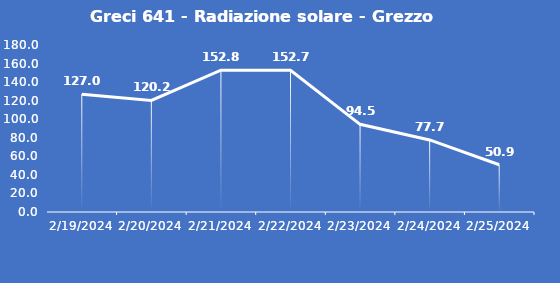
| Category | Greci 641 - Radiazione solare - Grezzo (W/m2) |
|---|---|
| 2/19/24 | 127 |
| 2/20/24 | 120.2 |
| 2/21/24 | 152.8 |
| 2/22/24 | 152.7 |
| 2/23/24 | 94.5 |
| 2/24/24 | 77.7 |
| 2/25/24 | 50.9 |